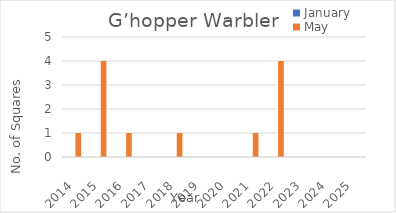
| Category | January | May |
|---|---|---|
| 2014.0 | 0 | 1 |
| 2015.0 | 0 | 4 |
| 2016.0 | 0 | 1 |
| 2017.0 | 0 | 0 |
| 2018.0 | 0 | 1 |
| 2019.0 | 0 | 0 |
| 2020.0 | 0 | 0 |
| 2021.0 | 0 | 1 |
| 2022.0 | 0 | 4 |
| 2023.0 | 0 | 0 |
| 2024.0 | 0 | 0 |
| 2025.0 | 0 | 0 |